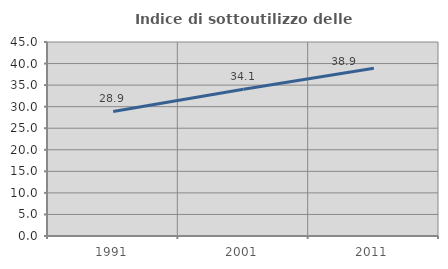
| Category | Indice di sottoutilizzo delle abitazioni  |
|---|---|
| 1991.0 | 28.889 |
| 2001.0 | 34.058 |
| 2011.0 | 38.932 |